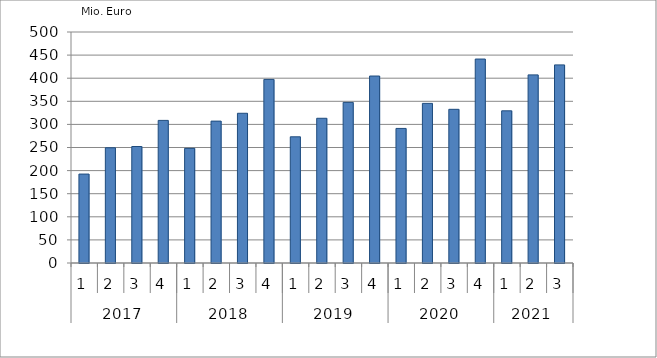
| Category | Ausbaugewerblicher Umsatz3 |
|---|---|
| 0 | 192499.539 |
| 1 | 249394.388 |
| 2 | 252146.755 |
| 3 | 308653.153 |
| 4 | 248133.418 |
| 5 | 307099.899 |
| 6 | 324088.989 |
| 7 | 397377.201 |
| 8 | 273159.137 |
| 9 | 313254.251 |
| 10 | 347631.281 |
| 11 | 404721.054 |
| 12 | 291272.144 |
| 13 | 345494.215 |
| 14 | 332629.265 |
| 15 | 441463.36 |
| 16 | 329380.212 |
| 17 | 407164.972 |
| 18 | 428783.222 |